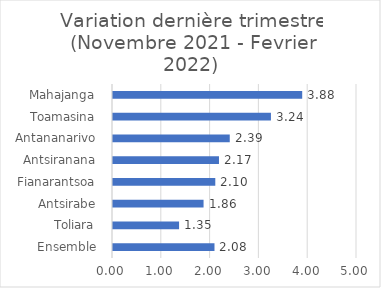
| Category | Variation dernière trimestre |
|---|---|
|  Ensemble  | 2.08 |
|  Toliara  | 1.354 |
|  Antsirabe  | 1.856 |
|  Fianarantsoa  | 2.096 |
|  Antsiranana  | 2.172 |
|  Antananarivo  | 2.393 |
|  Toamasina  | 3.236 |
|  Mahajanga  | 3.877 |